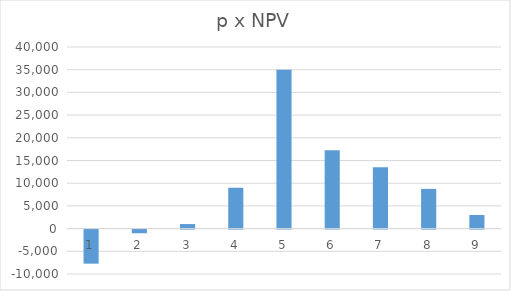
| Category | Series 0 |
|---|---|
| 0 | -7500 |
| 1 | -800 |
| 2 | 1000 |
| 3 | 9000 |
| 4 | 35000 |
| 5 | 17250 |
| 6 | 13500 |
| 7 | 8750 |
| 8 | 3000 |